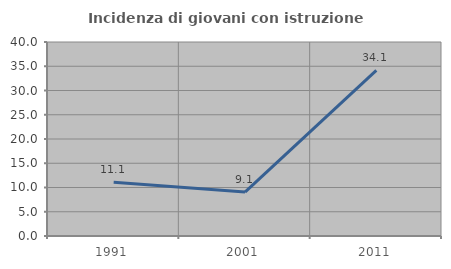
| Category | Incidenza di giovani con istruzione universitaria |
|---|---|
| 1991.0 | 11.066 |
| 2001.0 | 9.052 |
| 2011.0 | 34.146 |